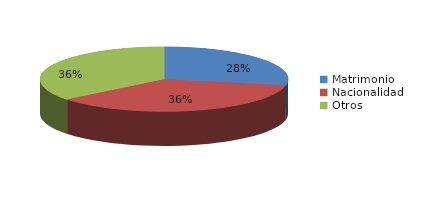
| Category | Series 0 |
|---|---|
| Matrimonio | 947 |
| Nacionalidad | 1207 |
| Otros | 1201 |